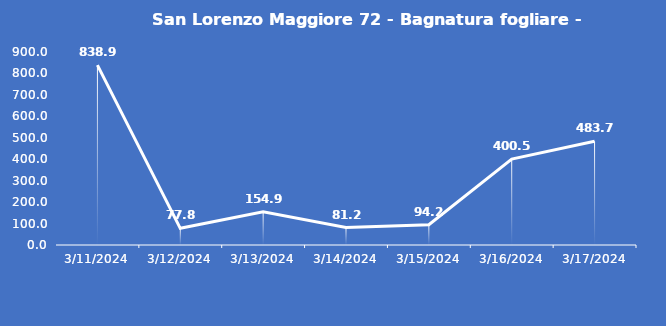
| Category | San Lorenzo Maggiore 72 - Bagnatura fogliare - Grezzo (min) |
|---|---|
| 3/11/24 | 838.9 |
| 3/12/24 | 77.8 |
| 3/13/24 | 154.9 |
| 3/14/24 | 81.2 |
| 3/15/24 | 94.2 |
| 3/16/24 | 400.5 |
| 3/17/24 | 483.7 |